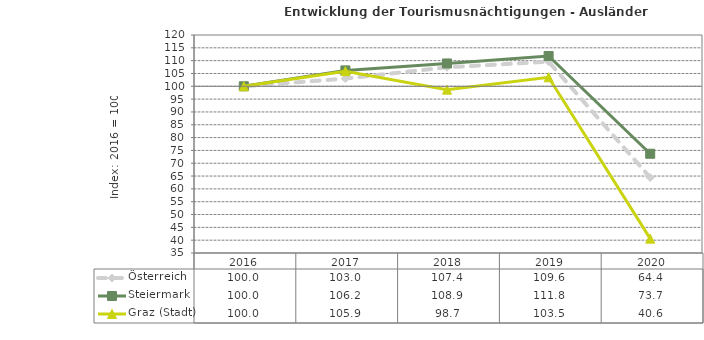
| Category | Österreich | Steiermark | Graz (Stadt) |
|---|---|---|---|
| 2020.0 | 64.4 | 73.7 | 40.6 |
| 2019.0 | 109.6 | 111.8 | 103.5 |
| 2018.0 | 107.4 | 108.9 | 98.7 |
| 2017.0 | 103 | 106.2 | 105.9 |
| 2016.0 | 100 | 100 | 100 |